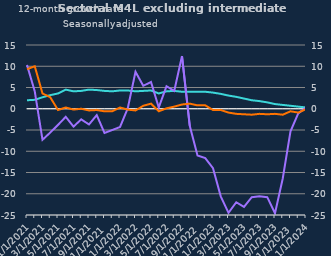
| Category | zero | Households | Non-intermediate OFCs |
|---|---|---|---|
| Jan-2021 | 0 | 2 | 10.3 |
| Feb-2021 | 0 | 2.1 | 4.1 |
| Mar-2021 | 0 | 2.7 | -7.3 |
| Apr-2021 | 0 | 3.2 | -5.6 |
| May-2021 | 0 | 3.6 | -3.8 |
| Jun-2021 | 0 | 4.5 | -1.9 |
| Jul-2021 | 0 | 4.1 | -4.2 |
| Aug-2021 | 0 | 4.2 | -2.5 |
| Sep-2021 | 0 | 4.5 | -3.7 |
| Oct-2021 | 0 | 4.4 | -1.5 |
| Nov-2021 | 0 | 4.2 | -5.7 |
| Dec-2021 | 0 | 4.1 | -5 |
| Jan-2022 | 0 | 4.3 | -4.3 |
| Feb-2022 | 0 | 4.3 | 0.1 |
| Mar-2022 | 0 | 4.1 | 8.7 |
| Apr-2022 | 0 | 4.2 | 5.4 |
| May-2022 | 0 | 4.3 | 6.3 |
| Jun-2022 | 0 | 3.6 | 0.3 |
| Jul-2022 | 0 | 4.1 | 5.3 |
| Aug-2022 | 0 | 4.2 | 4.2 |
| Sep-2022 | 0 | 4 | 12.4 |
| Oct-2022 | 0 | 4 | -4 |
| Nov-2022 | 0 | 4 | -11 |
| Dec-2022 | 0 | 4 | -11.6 |
| Jan-2023 | 0 | 3.8 | -14 |
| Feb-2023 | 0 | 3.5 | -20.6 |
| Mar-2023 | 0 | 3.1 | -24.5 |
| Apr-2023 | 0 | 2.8 | -22 |
| May-2023 | 0 | 2.4 | -23.1 |
| Jun-2023 | 0 | 2 | -20.8 |
| Jul-2023 | 0 | 1.8 | -20.6 |
| Aug-2023 | 0 | 1.5 | -20.8 |
| Sep-2023 | 0 | 1.1 | -24.6 |
| Oct-2023 | 0 | 0.9 | -16.4 |
| Nov-2023 | 0 | 0.7 | -5.3 |
| Dec-2023 | 0 | 0.5 | -1.1 |
| Jan-2024 | 0 | 0.3 | 0.3 |